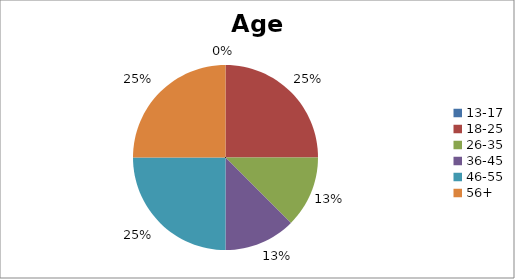
| Category | Age Group |
|---|---|
| 13-17 | 0 |
| 18-25 | 2 |
| 26-35 | 1 |
| 36-45 | 1 |
| 46-55 | 2 |
| 56+ | 2 |